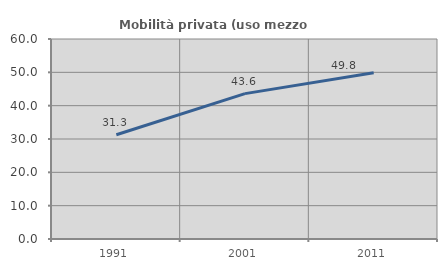
| Category | Mobilità privata (uso mezzo privato) |
|---|---|
| 1991.0 | 31.281 |
| 2001.0 | 43.609 |
| 2011.0 | 49.844 |